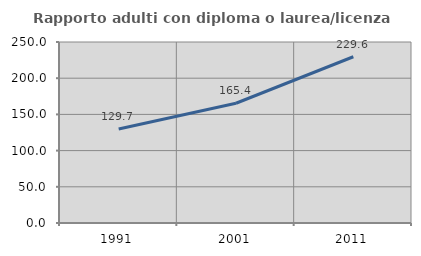
| Category | Rapporto adulti con diploma o laurea/licenza media  |
|---|---|
| 1991.0 | 129.73 |
| 2001.0 | 165.385 |
| 2011.0 | 229.63 |